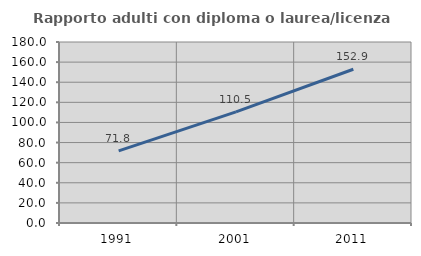
| Category | Rapporto adulti con diploma o laurea/licenza media  |
|---|---|
| 1991.0 | 71.801 |
| 2001.0 | 110.479 |
| 2011.0 | 152.88 |